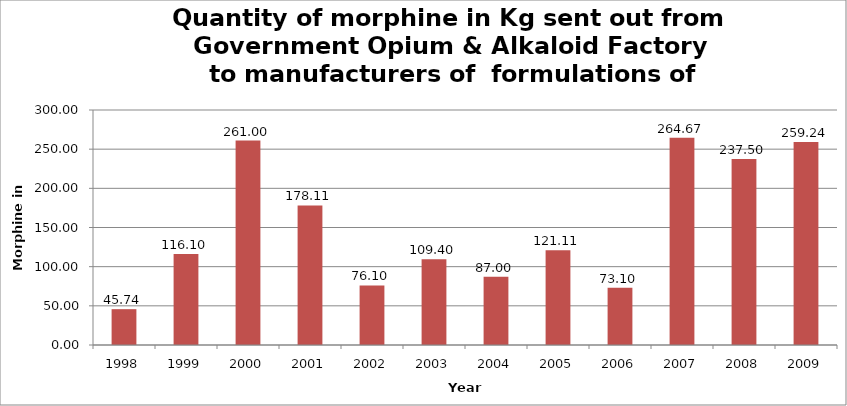
| Category | Kg |
|---|---|
| 1998.0 | 45.739 |
| 1999.0 | 116.098 |
| 2000.0 | 261 |
| 2001.0 | 178.108 |
| 2002.0 | 76.1 |
| 2003.0 | 109.4 |
| 2004.0 | 87 |
| 2005.0 | 121.113 |
| 2006.0 | 73.1 |
| 2007.0 | 264.667 |
| 2008.0 | 237.5 |
| 2009.0 | 259.24 |